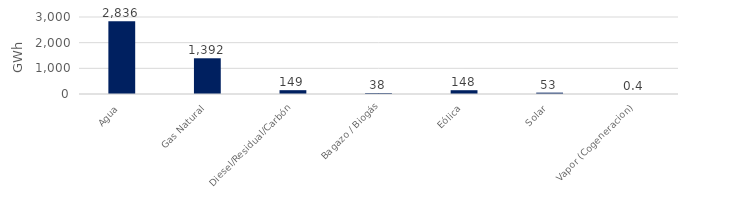
| Category | Series 0 |
|---|---|
| Agua | 2836.468 |
| Gas Natural | 1391.727 |
| Diesel/Residual/Carbón | 148.866 |
| Bagazo / Biogás | 37.851 |
| Eólica | 147.885 |
| Solar | 52.872 |
| Vapor (Cogeneracion) | 0.355 |